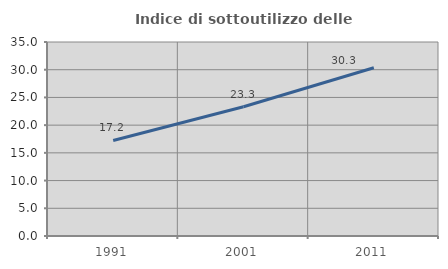
| Category | Indice di sottoutilizzo delle abitazioni  |
|---|---|
| 1991.0 | 17.237 |
| 2001.0 | 23.308 |
| 2011.0 | 30.346 |